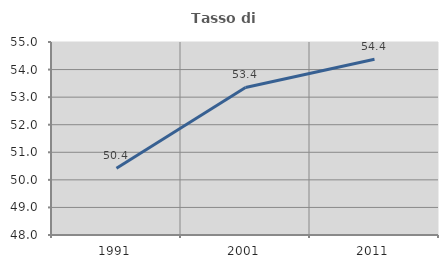
| Category | Tasso di occupazione   |
|---|---|
| 1991.0 | 50.424 |
| 2001.0 | 53.352 |
| 2011.0 | 54.374 |